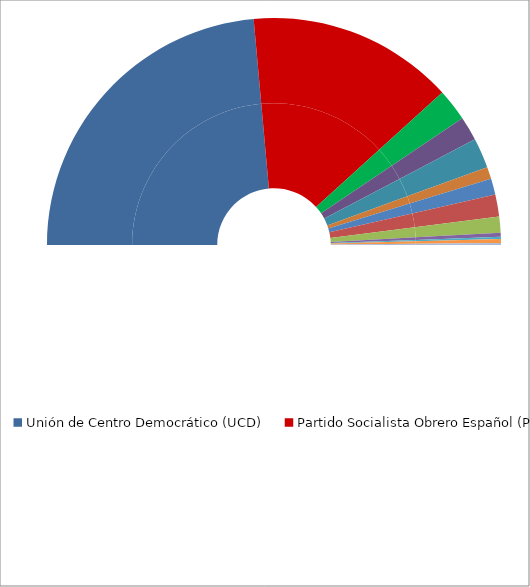
| Category | Escaños | (%) |
|---|---|---|
| Unión de Centro Democrático (UCD) | 165 | 47.143 |
| Partido Socialista Obrero Español (PSOE) | 103 | 29.429 |
| Alianza Popular (AP) | 16 | 4.571 |
| Partido Comunista de España (PCE) | 12 | 3.429 |
| Socialistes de Catalunya (PSC-PSOE) | 15 | 4.286 |
| Partido Socialista Popular - Unidad Socialista (PSP-US) | 6 | 1.714 |
| Partit Socialista Unificat de Catalunya (PSUC) | 8 | 2.286 |
| Pacte Democrátic per Catalunya (PDC) | 11 | 3.143 |
| Partido Nacionalista Vasco (PNV) | 8 | 2.286 |
| Coalición Electoral Unió del Centro i la Democracia Cristiana de Cataluña (UDC-CD) | 2 | 0.571 |
| Esquerra de Catalunya - Front Electoral Democratic (EC-FED) | 1 | 0.286 |
| Candidatura Independiente del Centro (CIC) | 2 | 0.571 |
| Euskadiko Ezquerra - Izquierda de Euskadi (EE-IE) | 1 | 0.286 |